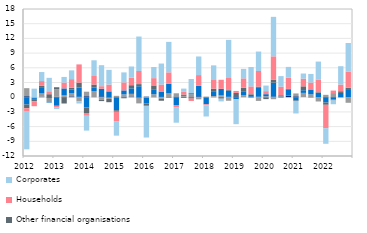
| Category | Non-profit and other organisations | Local authorities  | Currency in circulation | Other financial organisations | Households | Corporates |
|---|---|---|---|---|---|---|
| 2012 | 0.202 | 1.641 | -1.502 | -0.756 | -0.691 | -7.686 |
| II | 0.002 | -0.188 | -0.341 | -0.312 | -0.998 | 1.747 |
| III | 0.11 | 0.664 | 1.273 | 0.274 | 0.972 | 1.84 |
| IV | -0.138 | -0.873 | -0.098 | 0.61 | 0.594 | 2.749 |
| 2013 | 0.079 | 1.527 | -1.754 | 0.426 | -0.373 | -0.296 |
| II | 0.059 | 0.305 | 1.437 | -1.286 | 1.19 | 1.148 |
| III | 0.165 | 0.682 | 0.754 | 0.325 | 1.76 | 1.79 |
| IV | 0.076 | -0.87 | 1.873 | 1.027 | 3.718 | -0.415 |
| 2014 | 0.199 | 0.924 | -2.085 | -1.142 | -0.569 | -3.023 |
| II | 0.035 | 1.231 | 0.74 | 0.578 | 1.742 | 3.202 |
| III | 0.178 | -0.545 | 1.556 | -0.251 | 0.516 | 4.284 |
| IV | -0.104 | -0.237 | 1.19 | -0.68 | 1.391 | 3 |
| 2015 | -0.031 | 0.277 | -2.623 | -0.313 | -1.902 | -2.981 |
| II | 0.129 | 0.455 | 0.809 | -0.218 | 1.631 | 2.039 |
| III | 0.145 | 0.535 | 1.129 | 0.641 | 1.533 | 2.287 |
| IV | -0.109 | -1.155 | 2.237 | 0.437 | 2.676 | 7.032 |
| 2016 | 0.104 | -0.104 | -1.193 | -0.452 | -0.054 | -6.424 |
| II | -0.033 | 0.597 | 0.912 | 0.894 | 1.489 | 2.276 |
| III | 0.058 | -0.277 | 1.097 | -0.443 | 1.429 | 4.281 |
| IV | -0.001 | 0.781 | 1.984 | -0.118 | 2.31 | 6.213 |
| 2017 | 0.133 | 0.64 | -1.599 | 0.025 | -0.411 | -3.193 |
| II | 0.059 | 0.207 | -0.138 | 0.273 | 0.541 | 0.678 |
| III | 0.02 | 0.6 | 0.199 | -0.281 | -0.487 | 2.895 |
| IV | 0.183 | -0.435 | 2.116 | 0.066 | 2.148 | 3.798 |
| 2018 | -0.069 | 0.088 | -1.382 | 0.022 | -0.202 | -2.284 |
| II | 0.083 | 0.156 | 0.854 | 0.654 | 1.762 | 2.986 |
| III | 0.089 | 0.272 | 1.347 | -0.301 | 1.848 | -0.557 |
| IV | 0.082 | -0.727 | 1.258 | 0.234 | 2.481 | 7.641 |
| 2019 | 0.187 | 0.021 | -0.439 | 0.661 | 0.411 | -5.065 |
| II | -0.015 | 0.395 | 0.82 | 0.717 | 1.911 | 1.934 |
| III | 0.109 | -0.155 | 0.363 | 0.139 | 1.592 | 3.965 |
| IV | 0.106 | -0.756 | 1.801 | 0.269 | 3.171 | 3.974 |
| 2020 | -0.044 | 0.196 | 0.422 | -0.345 | 0.62 | 1.138 |
| II | 0.14 | -0.412 | 2.831 | 0.621 | 4.751 | 8.057 |
| III | 0.136 | 0.188 | -0.059 | 0.127 | 1.713 | 2.143 |
| IV | 0.323 | 0.01 | 1.279 | 0.077 | 2.288 | 2.209 |
| 2021 | 0.182 | 0.496 | -0.666 | -0.114 | 0.112 | -2.538 |
| II | 0.005 | 0.875 | 0.539 | 0.797 | 1.575 | 1.044 |
| III | 0.005 | 0.58 | 0.99 | -0.085 | 1.425 | 1.746 |
| IV | 0.001 | -0.875 | 0.906 | 0.121 | 2.584 | 3.656 |
| 2022 | 0.008 | 0.475 | -1.088 | -0.461 | -4.765 | -3.195 |
| II | -0.002 | 0.842 | -0.462 | -0.201 | 0.511 | -0.772 |
| III | -0.005 | -0.097 | 0.87 | 0.35 | 1.37 | 3.737 |
| IV | -0.006 | -1.134 | 1.656 | 0.277 | 3.299 | 5.835 |